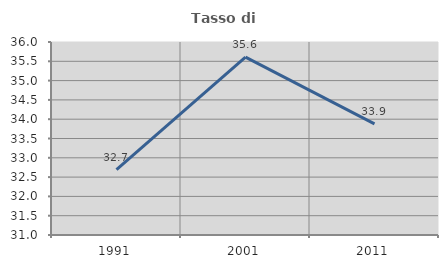
| Category | Tasso di occupazione   |
|---|---|
| 1991.0 | 32.692 |
| 2001.0 | 35.606 |
| 2011.0 | 33.878 |